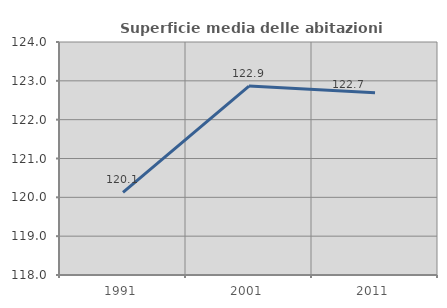
| Category | Superficie media delle abitazioni occupate |
|---|---|
| 1991.0 | 120.127 |
| 2001.0 | 122.865 |
| 2011.0 | 122.692 |